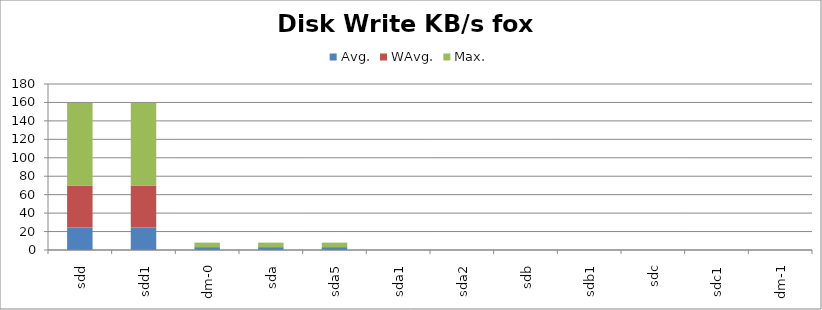
| Category | Avg. | WAvg. | Max. |
|---|---|---|---|
| sdd | 24.553 | 45.444 | 89.503 |
| sdd1 | 24.553 | 45.444 | 89.503 |
| dm-0 | 2.478 | 0.803 | 4.718 |
| sda | 2.475 | 0.798 | 4.727 |
| sda5 | 2.475 | 0.798 | 4.727 |
| sda1 | 0 | 0 | 0 |
| sda2 | 0 | 0 | 0 |
| sdb | 0 | 0 | 0 |
| sdb1 | 0 | 0 | 0 |
| sdc | 0 | 0 | 0 |
| sdc1 | 0 | 0 | 0 |
| dm-1 | 0 | 0 | 0 |